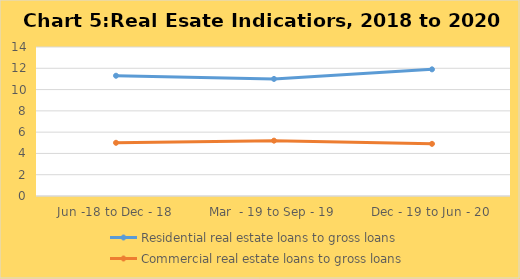
| Category | Residential real estate loans to gross loans | Commercial real estate loans to gross loans |
|---|---|---|
| Jun -18 to Dec - 18 | 11.3 | 5 |
| Mar  - 19 to Sep - 19 | 11 | 5.2 |
| Dec - 19 to Jun - 20 | 11.9 | 4.9 |